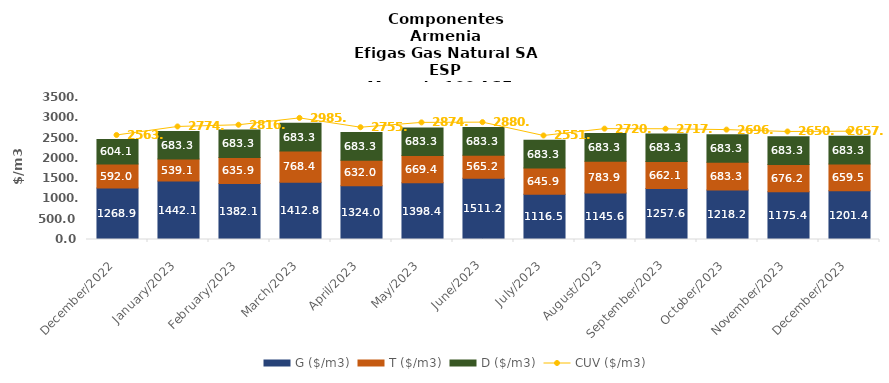
| Category | G ($/m3) | T ($/m3) | D ($/m3) |
|---|---|---|---|
| 2022-12-01 | 1268.91 | 592.03 | 604.09 |
| 2023-01-01 | 1442.084 | 539.064 | 683.343 |
| 2023-02-01 | 1382.137 | 635.944 | 683.343 |
| 2023-03-01 | 1412.843 | 768.353 | 683.343 |
| 2023-04-01 | 1324.021 | 631.998 | 683.343 |
| 2023-05-01 | 1398.419 | 669.403 | 683.343 |
| 2023-06-01 | 1511.242 | 565.219 | 683.343 |
| 2023-07-01 | 1116.463 | 645.939 | 683.343 |
| 2023-08-01 | 1145.565 | 783.894 | 683.343 |
| 2023-09-01 | 1257.568 | 662.12 | 683.343 |
| 2023-10-01 | 1218.237 | 683.343 | 683.34 |
| 2023-11-01 | 1175.364 | 676.175 | 683.343 |
| 2023-12-01 | 1201.409 | 659.456 | 683.343 |